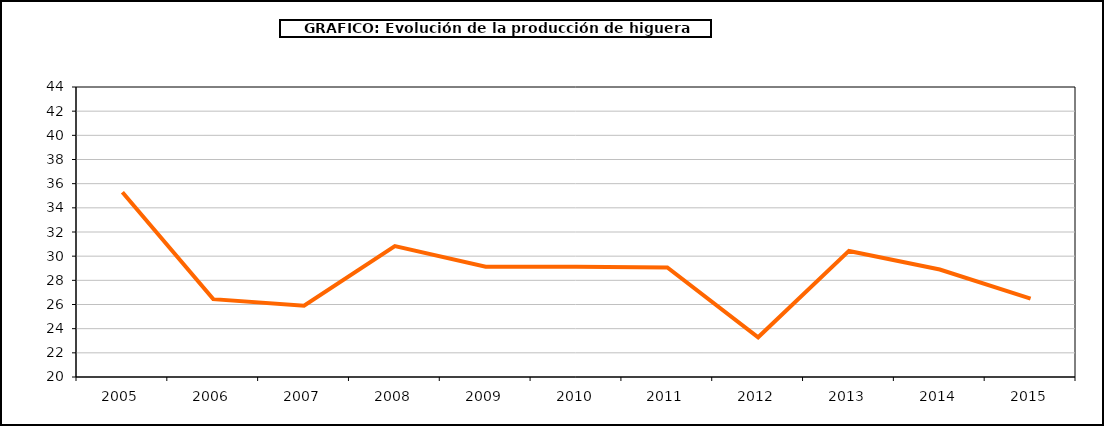
| Category | producción higuera |
|---|---|
| 2005.0 | 35.295 |
| 2006.0 | 26.442 |
| 2007.0 | 25.906 |
| 2008.0 | 30.828 |
| 2009.0 | 29.12 |
| 2010.0 | 29.12 |
| 2011.0 | 29.071 |
| 2012.0 | 23.285 |
| 2013.0 | 30.434 |
| 2014.0 | 28.893 |
| 2015.0 | 26.479 |